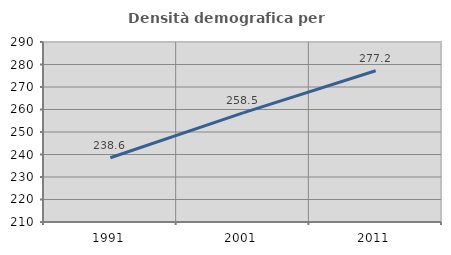
| Category | Densità demografica |
|---|---|
| 1991.0 | 238.57 |
| 2001.0 | 258.485 |
| 2011.0 | 277.228 |